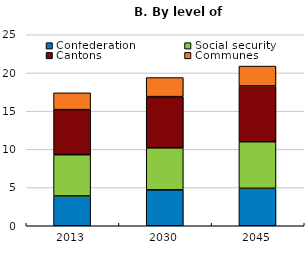
| Category | Confederation | Social security | Cantons | Communes |
|---|---|---|---|---|
| 2013.0 | 3.9 | 5.4 | 5.9 | 2.2 |
| 2030.0 | 4.7 | 5.5 | 6.7 | 2.5 |
| 2045.0 | 4.9 | 6.1 | 7.3 | 2.6 |